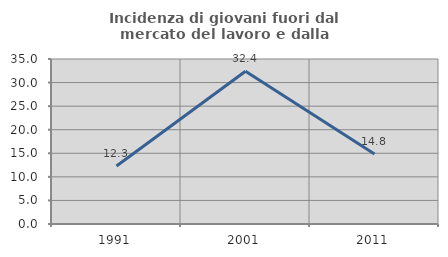
| Category | Incidenza di giovani fuori dal mercato del lavoro e dalla formazione  |
|---|---|
| 1991.0 | 12.291 |
| 2001.0 | 32.394 |
| 2011.0 | 14.844 |